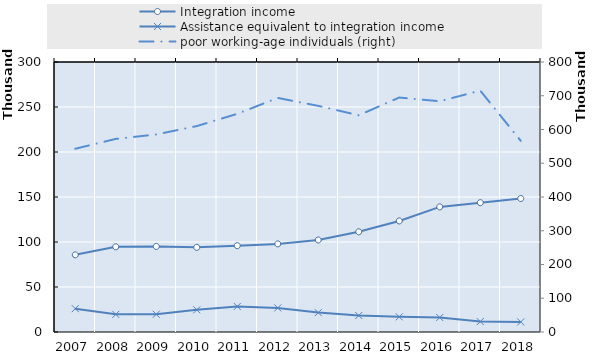
| Category | Integration income | Assistance equivalent to integration income |
|---|---|---|
| 2007.0 | 85738 | 25943 |
| 2008.0 | 94659 | 19618 |
| 2009.0 | 95052 | 19717 |
| 2010.0 | 94052 | 24598 |
| 2011.0 | 95880 | 28365 |
| 2012.0 | 97900 | 26773 |
| 2013.0 | 102269 | 21562 |
| 2014.0 | 111316 | 18304 |
| 2015.0 | 123388 | 16813 |
| 2016.0 | 139002 | 16120 |
| 2017.0 | 143684 | 11608 |
| 2018.0 | 148330 | 11182 |